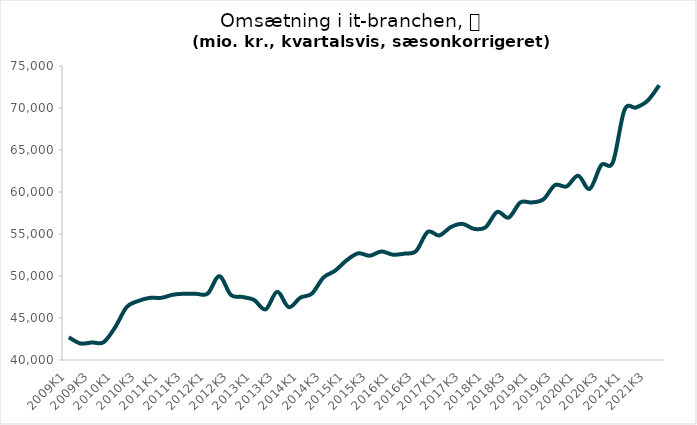
| Category | Series 0 |
|---|---|
| 2009K1 | 42703.959 |
| 2009K2 | 41970.825 |
| 2009K3 | 42085.944 |
| 2009K4 | 42110.677 |
| 2010K1 | 43885.997 |
| 2010K2 | 46293.177 |
| 2010K3 | 47021.635 |
| 2010K4 | 47396.014 |
| 2011K1 | 47402.372 |
| 2011K2 | 47771.283 |
| 2011K3 | 47895.917 |
| 2011K4 | 47878.364 |
| 2012K1 | 47909.516 |
| 2012K2 | 49982.206 |
| 2012K3 | 47751.29 |
| 2012K4 | 47499.565 |
| 2013K1 | 47153.972 |
| 2013K2 | 46028.375 |
| 2013K3 | 48113.853 |
| 2013K4 | 46290.204 |
| 2014K1 | 47422.859 |
| 2014K2 | 47904.003 |
| 2014K3 | 49818.035 |
| 2014K4 | 50626.5 |
| 2015K1 | 51867.607 |
| 2015K2 | 52701.888 |
| 2015K3 | 52414.247 |
| 2015K4 | 52916.31 |
| 2016K1 | 52539.79 |
| 2016K2 | 52661.875 |
| 2016K3 | 52971.991 |
| 2016K4 | 55248.698 |
| 2017K1 | 54828.893 |
| 2017K2 | 55822.228 |
| 2017K3 | 56206.629 |
| 2017K4 | 55616.235 |
| 2018K1 | 55797.573 |
| 2018K2 | 57624.214 |
| 2018K3 | 56956.491 |
| 2018K4 | 58754.22 |
| 2019K1 | 58757.52 |
| 2019K2 | 59126.873 |
| 2019K3 | 60825.103 |
| 2019K4 | 60663.573 |
| 2020K1 | 61942.615 |
| 2020K2 | 60368.173 |
| 2020K3 | 63214.783 |
| 2020K4 | 63549.356 |
| 2021K1 | 69756.707 |
| 2021K2 | 70055.765 |
| 2021K3 | 70871.842 |
| 2021K4 | 72704.783 |